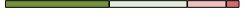
| Category | Series 0 | Series 1 | Series 2 | Series 3 |
|---|---|---|---|---|
| 0 | 8 | 6 | 3 | 1 |